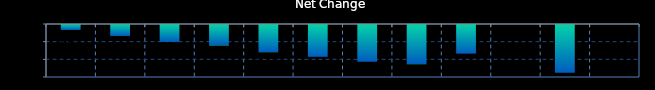
| Category | Series 0 |
|---|---|
| 0 | -0.14 |
| 1 | -0.31 |
| 2 | -0.48 |
| 3 | -0.58 |
| 4 | -0.77 |
| 5 | -0.9 |
| 6 | -1.04 |
| 7 | -1.11 |
| 8 | -0.81 |
| 9 | 0 |
| 10 | -1.35 |
| 11 | 0 |